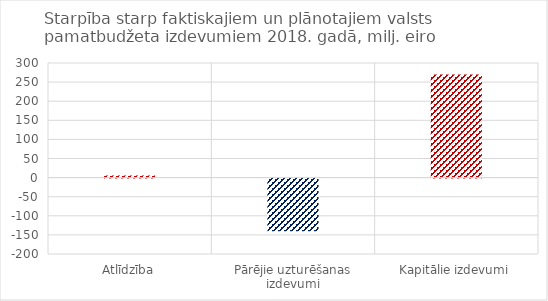
| Category | Starpība |
|---|---|
| Atlīdzība | 5266725 |
| Pārējie uzturēšanas izdevumi | -137744459 |
| Kapitālie izdevumi | 269601248 |